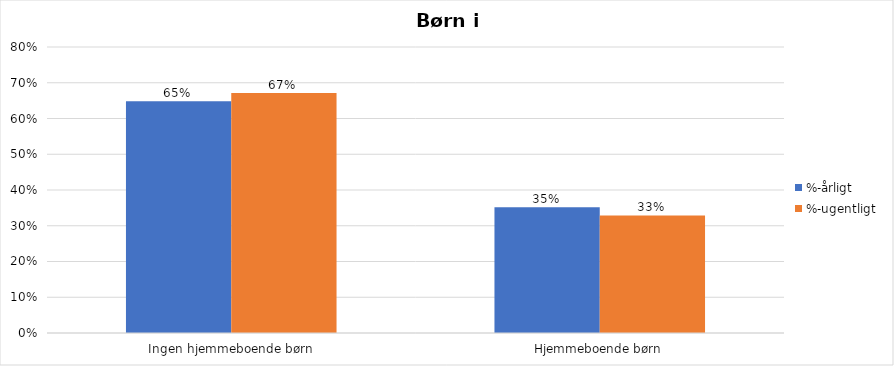
| Category | %-årligt | %-ugentligt |
|---|---|---|
| Ingen hjemmeboende børn | 0.649 | 0.671 |
| Hjemmeboende børn | 0.351 | 0.329 |